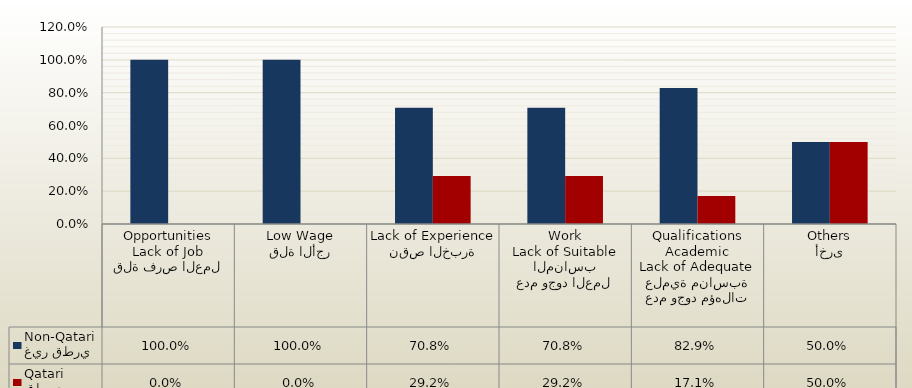
| Category | غير قطري
Non-Qatari | قطري
Qatari |
|---|---|---|
| قلة فرص العمل
Lack of Job Opportunities | 1 | 0 |
| قلة الأجر
Low Wage | 1 | 0 |
| نقص الخبرة
Lack of Experience | 0.708 | 0.292 |
| عدم وجود العمل المناسب
Lack of Suitable Work | 0.708 | 0.292 |
| عدم وجود مؤهلات علمية مناسبة
Lack of Adequate Academic Qualifications | 0.829 | 0.171 |
| أخرى
Others | 0.5 | 0.5 |